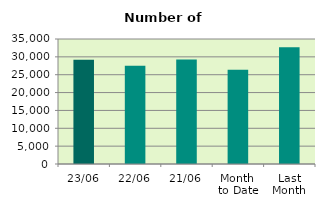
| Category | Series 0 |
|---|---|
| 23/06 | 29184 |
| 22/06 | 27484 |
| 21/06 | 29294 |
| Month 
to Date | 26374.941 |
| Last
Month | 32723.818 |